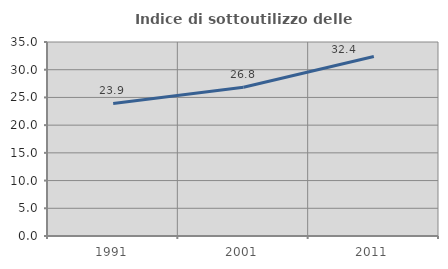
| Category | Indice di sottoutilizzo delle abitazioni  |
|---|---|
| 1991.0 | 23.913 |
| 2001.0 | 26.843 |
| 2011.0 | 32.377 |